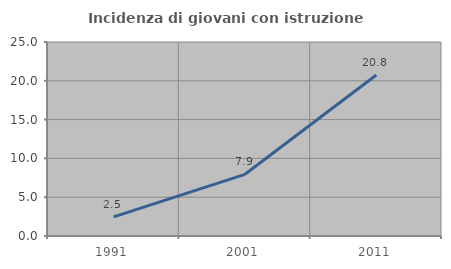
| Category | Incidenza di giovani con istruzione universitaria |
|---|---|
| 1991.0 | 2.465 |
| 2001.0 | 7.95 |
| 2011.0 | 20.751 |